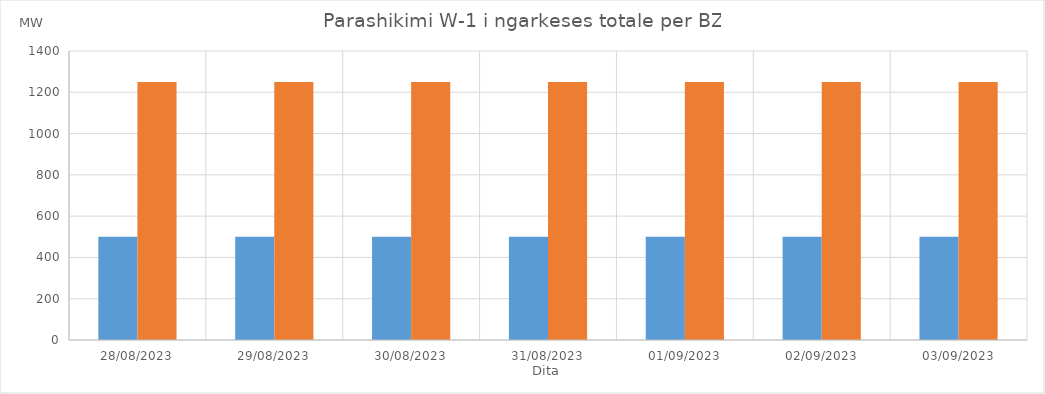
| Category | Min (MW) | Max (MW) |
|---|---|---|
| 28/08/2023 | 500 | 1250 |
| 29/08/2023 | 500 | 1250 |
| 30/08/2023 | 500 | 1250 |
| 31/08/2023 | 500 | 1250 |
| 01/09/2023 | 500 | 1250 |
| 02/09/2023 | 500 | 1250 |
| 03/09/2023 | 500 | 1250 |